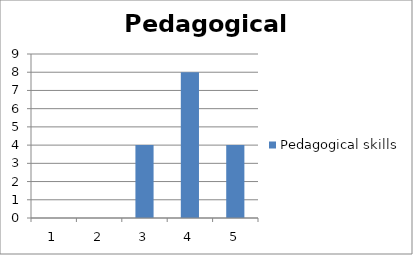
| Category | Pedagogical skills |
|---|---|
| 0 | 0 |
| 1 | 0 |
| 2 | 4 |
| 3 | 8 |
| 4 | 4 |